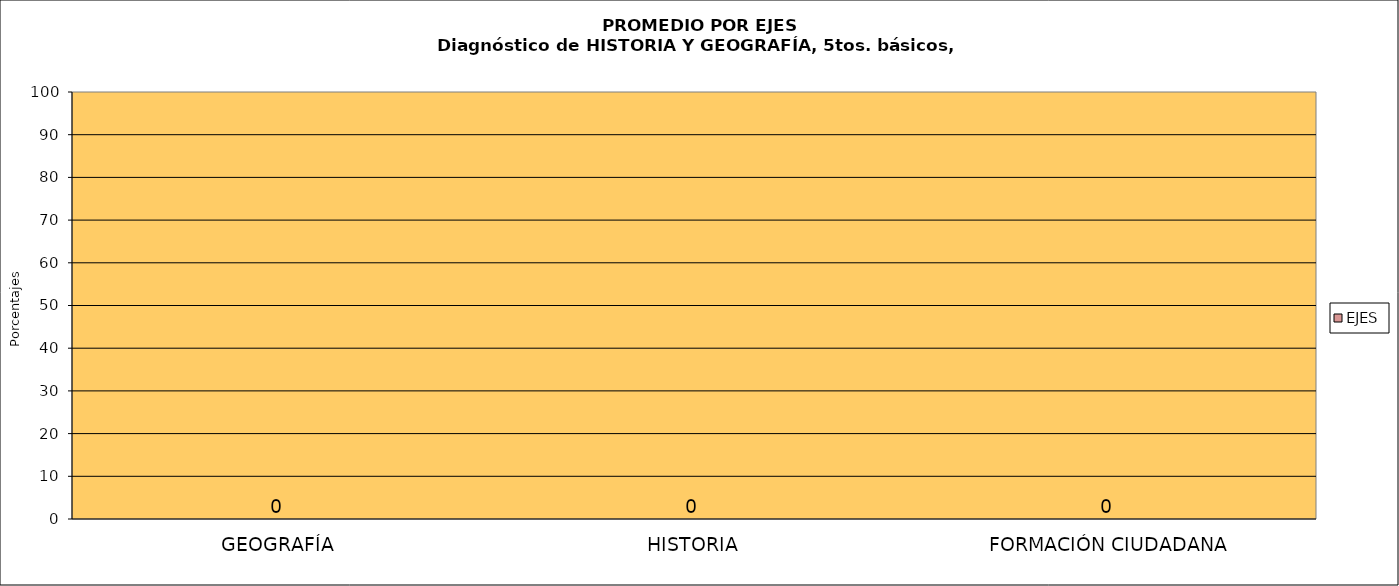
| Category | EJES |
|---|---|
| GEOGRAFÍA | 0 |
| HISTORIA | 0 |
| FORMACIÓN CIUDADANA | 0 |